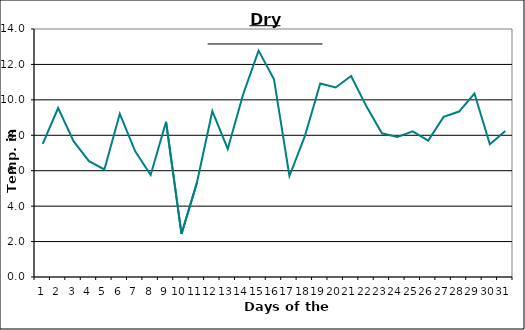
| Category | Series 0 |
|---|---|
| 0 | 7.51 |
| 1 | 9.54 |
| 2 | 7.67 |
| 3 | 6.54 |
| 4 | 6.07 |
| 5 | 9.21 |
| 6 | 7.09 |
| 7 | 5.76 |
| 8 | 8.76 |
| 9 | 2.43 |
| 10 | 5.32 |
| 11 | 9.36 |
| 12 | 7.23 |
| 13 | 10.32 |
| 14 | 12.78 |
| 15 | 11.16 |
| 16 | 5.7 |
| 17 | 7.95 |
| 18 | 10.92 |
| 19 | 10.7 |
| 20 | 11.35 |
| 21 | 9.62 |
| 22 | 8.11 |
| 23 | 7.91 |
| 24 | 8.22 |
| 25 | 7.7 |
| 26 | 9.04 |
| 27 | 9.34 |
| 28 | 10.36 |
| 29 | 7.49 |
| 30 | 8.24 |